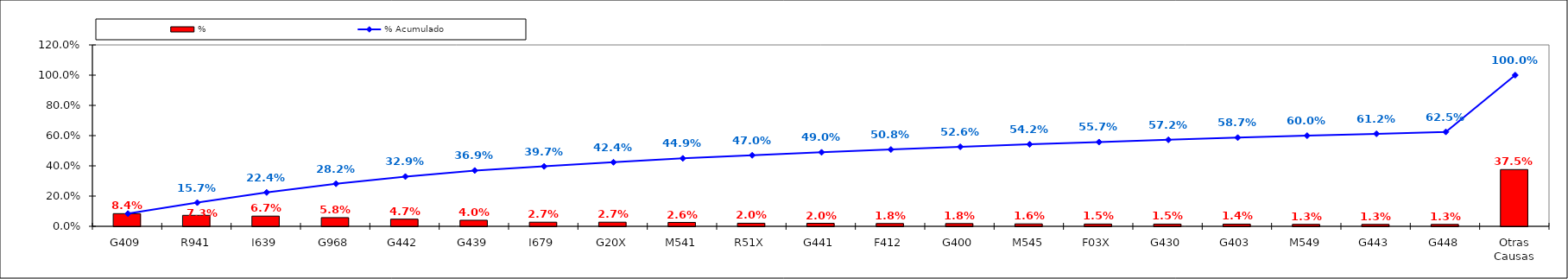
| Category | % |
|---|---|
| G409 | 0.084 |
| R941 | 0.073 |
| I639 | 0.067 |
| G968 | 0.058 |
| G442 | 0.047 |
| G439 | 0.04 |
| I679 | 0.027 |
| G20X | 0.027 |
| M541 | 0.026 |
| R51X | 0.02 |
| G441 | 0.02 |
| F412 | 0.018 |
| G400 | 0.018 |
| M545 | 0.016 |
| F03X | 0.015 |
| G430 | 0.015 |
| G403 | 0.014 |
| M549 | 0.013 |
| G443 | 0.013 |
| G448 | 0.013 |
| Otras Causas | 0.375 |